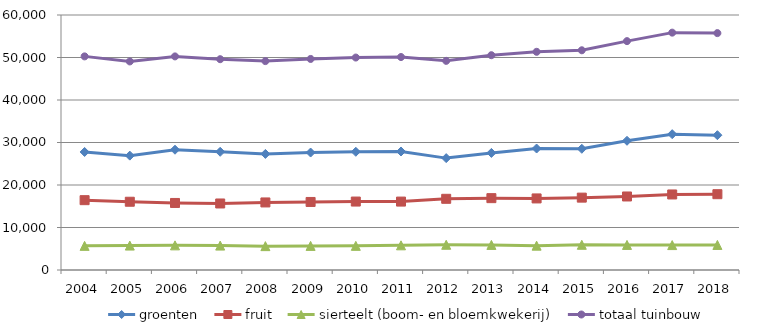
| Category | groenten | fruit | sierteelt (boom- en bloemkwekerij) | totaal tuinbouw |
|---|---|---|---|---|
| 2004.0 | 27770 | 16432 | 5677.21 | 50263 |
| 2005.0 | 26911 | 16060 | 5748.87 | 49072 |
| 2006.0 | 28299 | 15773 | 5797 | 50255.4 |
| 2007.0 | 27816 | 15652 | 5744 | 49599 |
| 2008.0 | 27313 | 15897 | 5615 | 49154 |
| 2009.0 | 27637 | 16009 | 5673 | 49657 |
| 2010.0 | 27813 | 16104 | 5682 | 49989 |
| 2011.0 | 27885 | 16099 | 5808 | 50110 |
| 2012.0 | 26327 | 16751 | 5935 | 49211 |
| 2013.0 | 27548 | 16906 | 5901 | 50539 |
| 2014.0 | 28584 | 16840 | 5727 | 51338 |
| 2015.0 | 28519 | 17028 | 5931.8 | 51699 |
| 2016.0 | 30407 | 17298 | 5901.28 | 53851 |
| 2017.0 | 31956 | 17773 | 5862.33 | 55849 |
| 2018.0 | 31719 | 17837 | 5894.68 | 55737 |